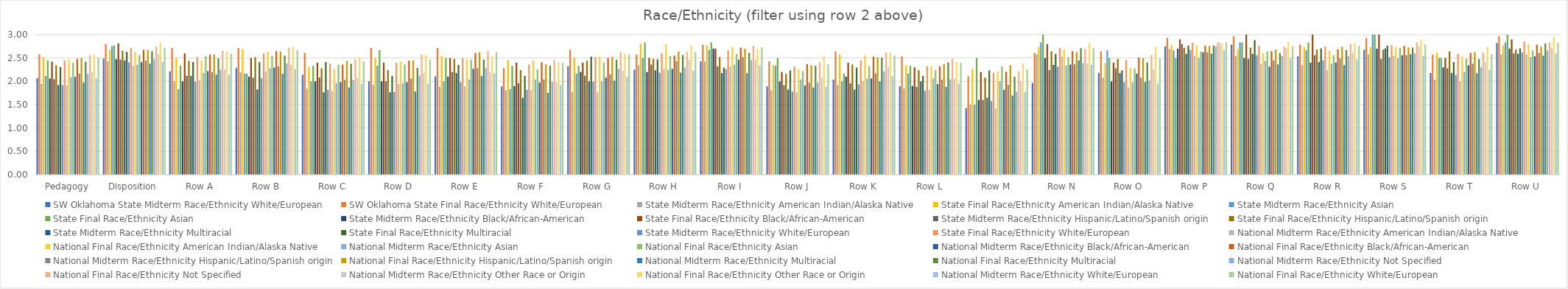
| Category | SW Oklahoma State | State | National |
|---|---|---|---|
| Pedagogy | 2.577 | 2.447 | 2.514 |
| Disposition | 2.799 | 2.714 | 2.716 |
| Row A | 2.714 | 2.52 | 2.592 |
| Row B | 2.714 | 2.597 | 2.669 |
| Row C | 2.607 | 2.378 | 2.432 |
| Row D | 2.714 | 2.398 | 2.464 |
| Row E | 2.714 | 2.5 | 2.632 |
| Row F | 2.286 | 2.362 | 2.395 |
| Row G | 2.679 | 2.52 | 2.573 |
| Row H | 2.571 | 2.602 | 2.626 |
| Row I | 2.786 | 2.663 | 2.73 |
| Row J | 2.429 | 2.316 | 2.364 |
| Row K | 2.643 | 2.449 | 2.551 |
| Row L | 2.536 | 2.321 | 2.4 |
| Row M | 2.107 | 2.184 | 2.258 |
| Row N | 2.607 | 2.714 | 2.708 |
| Row O | 2.643 | 2.454 | 2.488 |
| Row P | 2.929 | 2.826 | 2.832 |
| Row Q | 2.964 | 2.76 | 2.747 |
| Row R | 2.786 | 2.745 | 2.76 |
| Row S | 2.929 | 2.77 | 2.79 |
| Row T | 2.571 | 2.587 | 2.579 |
| Row U | 2.964 | 2.852 | 2.828 |